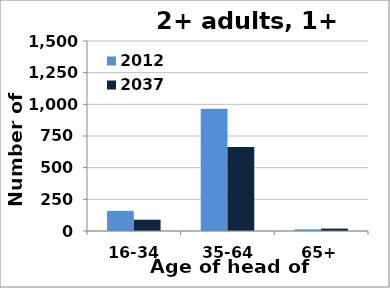
| Category | 2012 | 2037 |
|---|---|---|
| 16-34 | 159 | 89 |
| 35-64 | 965 | 663 |
| 65+ | 13 | 19 |